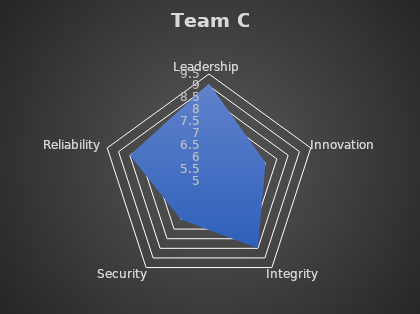
| Category | Team C |
|---|---|
| Leadership | 9.1 |
| Innovation | 7.5 |
| Integrity | 8.5 |
| Security | 7 |
| Reliability | 8.5 |